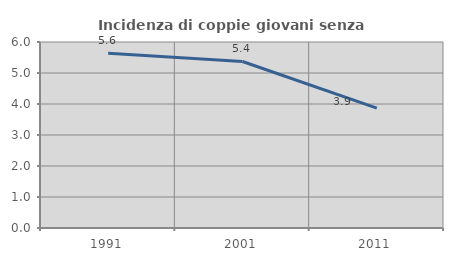
| Category | Incidenza di coppie giovani senza figli |
|---|---|
| 1991.0 | 5.636 |
| 2001.0 | 5.371 |
| 2011.0 | 3.865 |